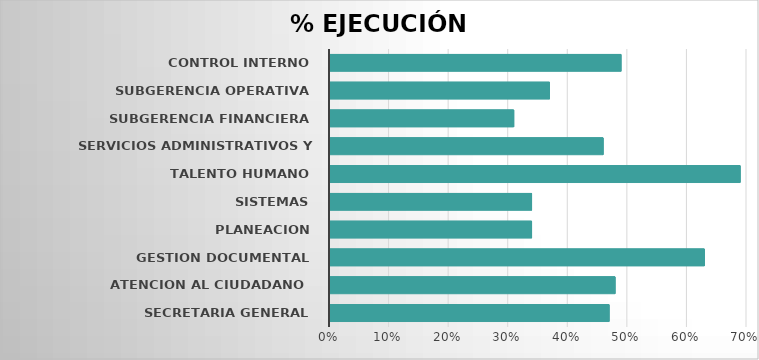
| Category | Series 0 |
|---|---|
| SECRETARIA GENERAL | 0.47 |
| ATENCION AL CIUDADANO  | 0.48 |
| GESTION DOCUMENTAL | 0.63 |
| PLANEACION | 0.34 |
| SISTEMAS | 0.34 |
| TALENTO HUMANO | 0.69 |
| SERVICIOS ADMINISTRATIVOS Y LOGISTICOS | 0.46 |
| SUBGERENCIA FINANCIERA | 0.31 |
| SUBGERENCIA OPERATIVA | 0.37 |
| CONTROL INTERNO | 0.49 |